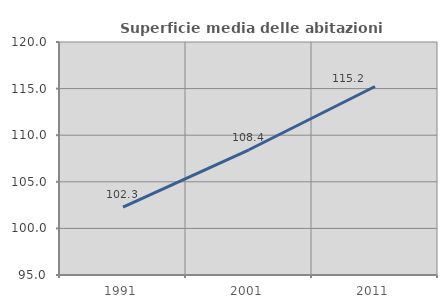
| Category | Superficie media delle abitazioni occupate |
|---|---|
| 1991.0 | 102.291 |
| 2001.0 | 108.437 |
| 2011.0 | 115.225 |